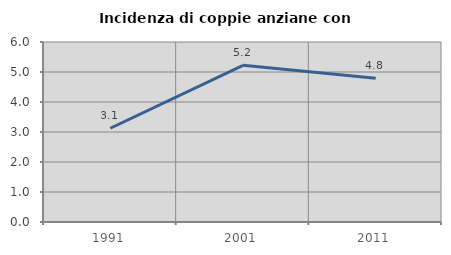
| Category | Incidenza di coppie anziane con figli |
|---|---|
| 1991.0 | 3.125 |
| 2001.0 | 5.224 |
| 2011.0 | 4.795 |